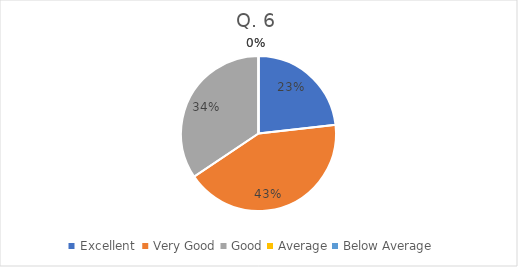
| Category | Series 0 |
|---|---|
| Excellent  | 29 |
| Very Good | 53 |
| Good | 43 |
| Average | 0 |
| Below Average | 0 |